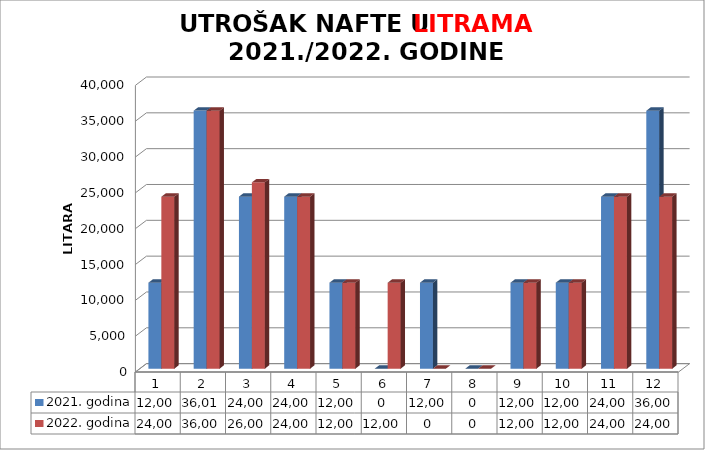
| Category | 2021. godina | 2022. godina |
|---|---|---|
| 0 | 12000 | 24000 |
| 1 | 36012 | 36000 |
| 2 | 24007 | 26000 |
| 3 | 24005 | 24006 |
| 4 | 12002 | 12000 |
| 5 | 0 | 12000 |
| 6 | 12004 | 0 |
| 7 | 0 | 0 |
| 8 | 12001 | 12000 |
| 9 | 12001 | 12000 |
| 10 | 24000 | 24001 |
| 11 | 36000 | 24001 |